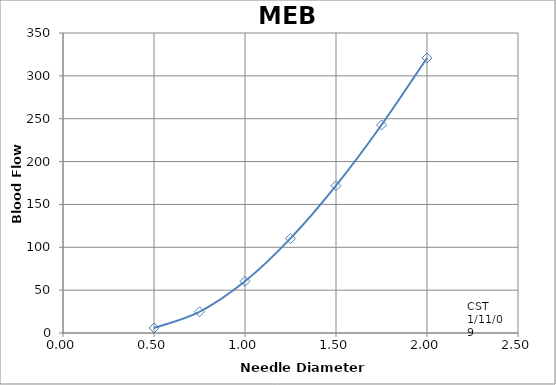
| Category | Series 0 |
|---|---|
| 0.5 | 5.85 |
| 0.75 | 24.72 |
| 1.0 | 60.29 |
| 1.25 | 110.36 |
| 1.5 | 171.93 |
| 1.75 | 242.69 |
| 2.0 | 320.82 |